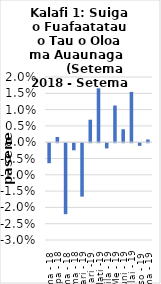
| Category | All items - m-m changes |
|---|---|
| Setema - 18 | -0.006 |
| Oketopa - 18 | 0.002 |
| Novema - 18 | -0.022 |
| Tesema - 18 | -0.002 |
| Ianuari - 19 | -0.016 |
| Fepuari -19 | 0.007 |
| Mati -19 | 0.017 |
| Aperila - 19 | -0.002 |
| Me - 19 | 0.011 |
| Iuni - 19 | 0.004 |
| Iulai - 19 | 0.015 |
| Aukuso - 19 | -0.001 |
| Setema - 19 | 0.001 |